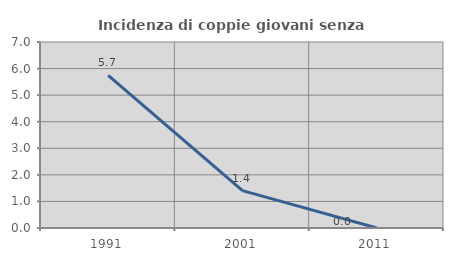
| Category | Incidenza di coppie giovani senza figli |
|---|---|
| 1991.0 | 5.747 |
| 2001.0 | 1.408 |
| 2011.0 | 0 |